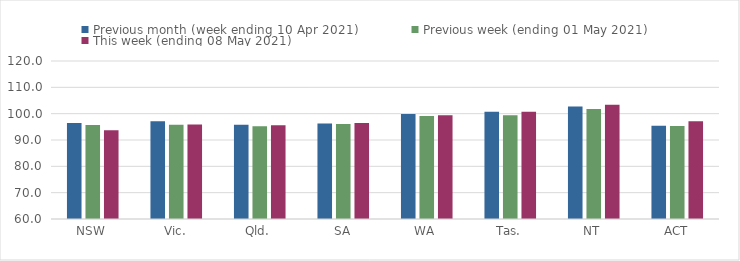
| Category | Previous month (week ending 10 Apr 2021) | Previous week (ending 01 May 2021) | This week (ending 08 May 2021) |
|---|---|---|---|
| NSW | 96.44 | 95.65 | 93.67 |
| Vic. | 97.16 | 95.83 | 95.92 |
| Qld. | 95.77 | 95.22 | 95.59 |
| SA | 96.31 | 96.06 | 96.42 |
| WA | 99.89 | 99.11 | 99.41 |
| Tas. | 100.7 | 99.36 | 100.76 |
| NT | 102.73 | 101.77 | 103.35 |
| ACT | 95.43 | 95.29 | 97.1 |